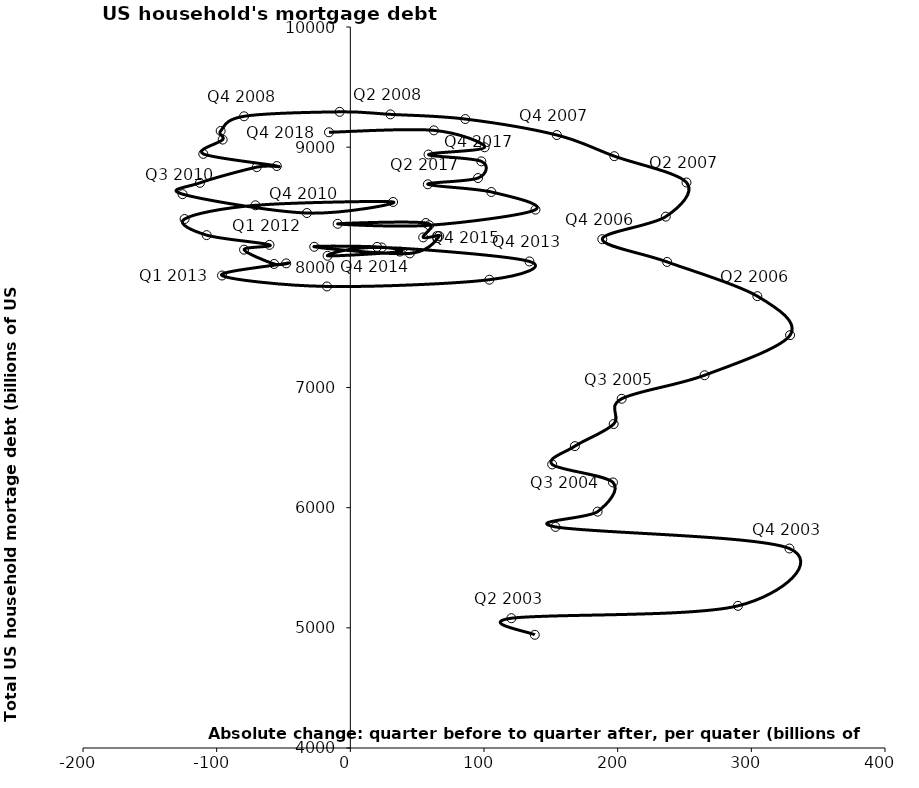
| Category | Series 0 |
|---|---|
| 138.0 | 4942 |
| 120.5 | 5080 |
| 290.0 | 5183 |
| 328.5 | 5660 |
| 153.5 | 5840 |
| 185.0 | 5967 |
| 196.5 | 6210 |
| 151.0 | 6360 |
| 168.0 | 6512 |
| 197.0 | 6696 |
| 203.0 | 6906 |
| 265.0 | 7102 |
| 329.0 | 7436 |
| 304.5 | 7760 |
| 237.0 | 8045 |
| 188.5 | 8234 |
| 236.0 | 8422 |
| 251.5 | 8706 |
| 197.5 | 8925 |
| 154.5 | 9101 |
| 86.0 | 9234 |
| 30.0 | 9273 |
| -8.0 | 9294 |
| -79.5 | 9257 |
| -97.0 | 9135 |
| -95.5 | 9063 |
| -110.0 | 8944 |
| -55.0 | 8843 |
| -70.0 | 8834 |
| -112.5 | 8703 |
| -125.5 | 8609 |
| -32.5 | 8452 |
| 32.0 | 8544 |
| -71.0 | 8516 |
| -124.0 | 8402 |
| -107.50000000000045 | 8268 |
| -60.5 | 8187 |
| -79.49999999999909 | 8147 |
| -57.000000000000455 | 8028 |
| -48.000000000000455 | 8033 |
| -95.99999999999955 | 7932 |
| -17.5 | 7841 |
| 103.99999999999955 | 7897 |
| 133.99999999999955 | 8049 |
| 23.500000000000455 | 8165 |
| -16.999999999999545 | 8096 |
| 37.0 | 8131 |
| 19.999999999999545 | 8170 |
| -27.0 | 8171 |
| 44.500000000000455 | 8116 |
| 66.5 | 8260 |
| 54.5 | 8249 |
| 56.5 | 8369 |
| -9.5 | 8362 |
| 59.0 | 8350 |
| 138.5 | 8480 |
| 105.5 | 8627 |
| 58.0 | 8691 |
| 95.5 | 8743 |
| 98.0 | 8882 |
| 58.5 | 8939 |
| 100.5 | 8999 |
| 62.5 | 9140 |
| -16.0 | 9124 |